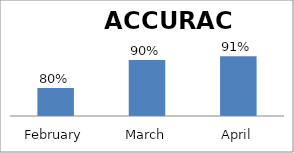
| Category | ACCURACY |
|---|---|
| February | 0.8 |
| March | 0.9 |
| April | 0.913 |